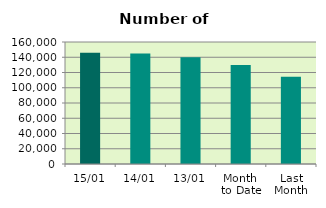
| Category | Series 0 |
|---|---|
| 15/01 | 145894 |
| 14/01 | 144856 |
| 13/01 | 139902 |
| Month 
to Date | 129792 |
| Last
Month | 114459.3 |